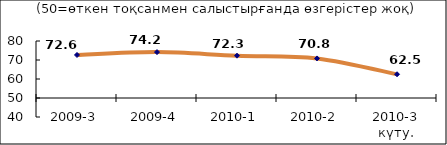
| Category | Диф.индекс ↓ |
|---|---|
| 2009-3 | 72.645 |
| 2009-4 | 74.155 |
| 2010-1 | 72.27 |
| 2010-2 | 70.83 |
| 2010-3 күту. | 62.5 |